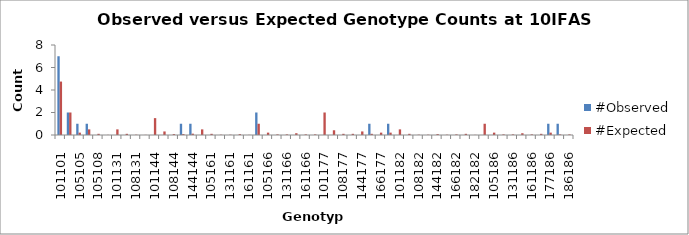
| Category | #Observed | #Expected |
|---|---|---|
| 101101.0 | 7 | 4.75 |
| 101105.0 | 2 | 2 |
| 105105.0 | 1 | 0.211 |
| 101108.0 | 1 | 0.5 |
| 105108.0 | 0 | 0.105 |
| 108108.0 | 0 | 0.013 |
| 101131.0 | 0 | 0.5 |
| 105131.0 | 0 | 0.105 |
| 108131.0 | 0 | 0.026 |
| 131131.0 | 0 | 0.013 |
| 101144.0 | 0 | 1.5 |
| 105144.0 | 0 | 0.316 |
| 108144.0 | 0 | 0.079 |
| 131144.0 | 1 | 0.079 |
| 144144.0 | 1 | 0.118 |
| 101161.0 | 0 | 0.5 |
| 105161.0 | 0 | 0.105 |
| 108161.0 | 0 | 0.026 |
| 131161.0 | 0 | 0.026 |
| 144161.0 | 0 | 0.079 |
| 161161.0 | 0 | 0.013 |
| 101166.0 | 2 | 1 |
| 105166.0 | 0 | 0.211 |
| 108166.0 | 0 | 0.053 |
| 131166.0 | 0 | 0.053 |
| 144166.0 | 0 | 0.158 |
| 161166.0 | 0 | 0.053 |
| 166166.0 | 0 | 0.053 |
| 101177.0 | 0 | 2 |
| 105177.0 | 0 | 0.421 |
| 108177.0 | 0 | 0.105 |
| 131177.0 | 0 | 0.105 |
| 144177.0 | 0 | 0.316 |
| 161177.0 | 1 | 0.105 |
| 166177.0 | 0 | 0.211 |
| 177177.0 | 1 | 0.211 |
| 101182.0 | 0 | 0.5 |
| 105182.0 | 0 | 0.105 |
| 108182.0 | 0 | 0.026 |
| 131182.0 | 0 | 0.026 |
| 144182.0 | 0 | 0.079 |
| 161182.0 | 0 | 0.026 |
| 166182.0 | 0 | 0.053 |
| 177182.0 | 0 | 0.105 |
| 182182.0 | 0 | 0.013 |
| 101186.0 | 0 | 1 |
| 105186.0 | 0 | 0.211 |
| 108186.0 | 0 | 0.053 |
| 131186.0 | 0 | 0.053 |
| 144186.0 | 0 | 0.158 |
| 161186.0 | 0 | 0.053 |
| 166186.0 | 0 | 0.105 |
| 177186.0 | 1 | 0.211 |
| 182186.0 | 1 | 0.053 |
| 186186.0 | 0 | 0.053 |